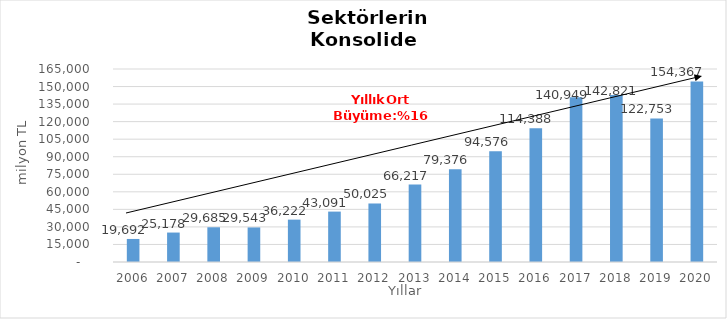
| Category | Toplam |
|---|---|
| 2006.0 | 19691.807 |
| 2007.0 | 25178.471 |
| 2008.0 | 29685 |
| 2009.0 | 29543.192 |
| 2010.0 | 36222.019 |
| 2011.0 | 43090.622 |
| 2012.0 | 50025.409 |
| 2013.0 | 66217.364 |
| 2014.0 | 79376 |
| 2015.0 | 94576 |
| 2016.0 | 114388 |
| 2017.0 | 140949 |
| 2018.0 | 142821 |
| 2019.0 | 122753 |
| 2020.0 | 154367 |